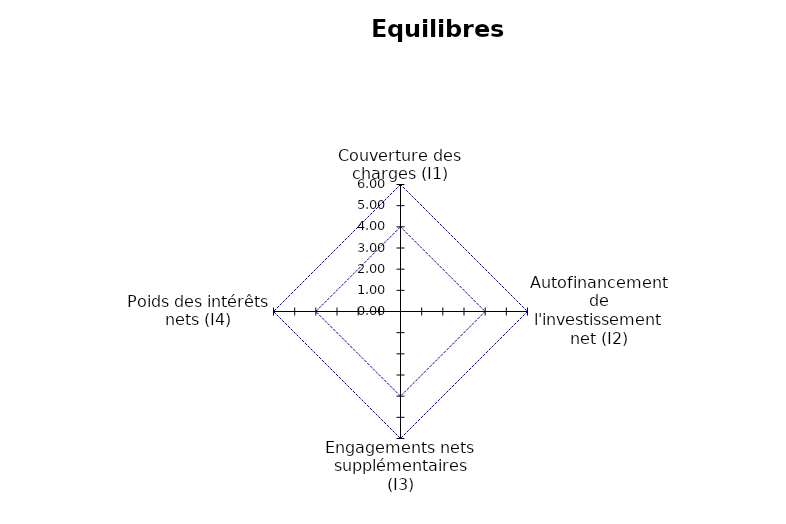
| Category | Valeurs des incateurs | Valeurs moyennes des indicateurs | max |
|---|---|---|---|
| Couverture des charges (I1) | 0 | 4 | 6 |
| Autofinancement de l'investissement net (I2) | 0 | 4 | 6 |
| Engagements nets supplémentaires (I3) | 0 | 4 | 6 |
| Poids des intérêts nets (I4) | 0 | 4 | 6 |